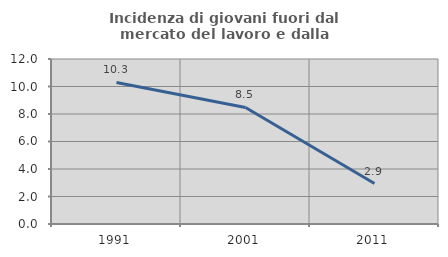
| Category | Incidenza di giovani fuori dal mercato del lavoro e dalla formazione  |
|---|---|
| 1991.0 | 10.294 |
| 2001.0 | 8.475 |
| 2011.0 | 2.941 |